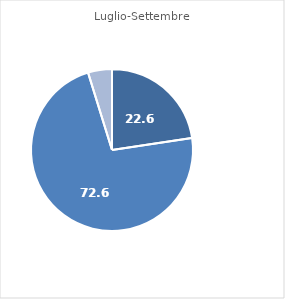
| Category | Series 1 | Series 2 | Series 0 |
|---|---|---|---|
| 0 | 22.623 | 56.03 | 56.03 |
| 1 | 72.596 | 29.431 | 29.431 |
| 2 | 4.778 | 14.539 | 14.539 |